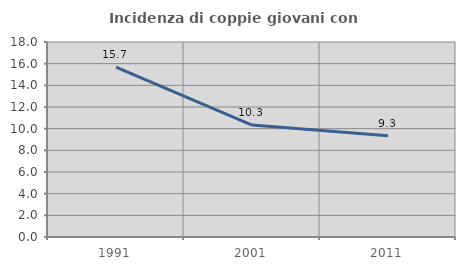
| Category | Incidenza di coppie giovani con figli |
|---|---|
| 1991.0 | 15.674 |
| 2001.0 | 10.328 |
| 2011.0 | 9.34 |